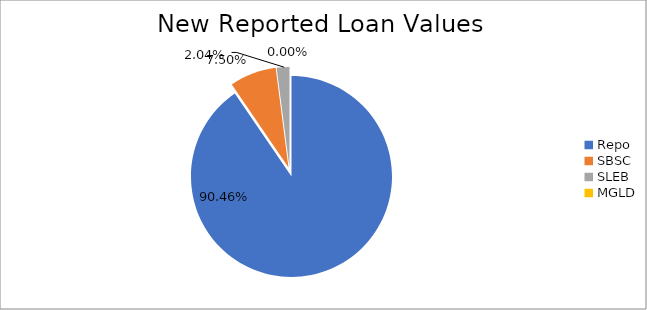
| Category | Series 0 |
|---|---|
| Repo | 10099453.935 |
| SBSC | 836854.368 |
| SLEB | 228128.246 |
| MGLD | 11.521 |